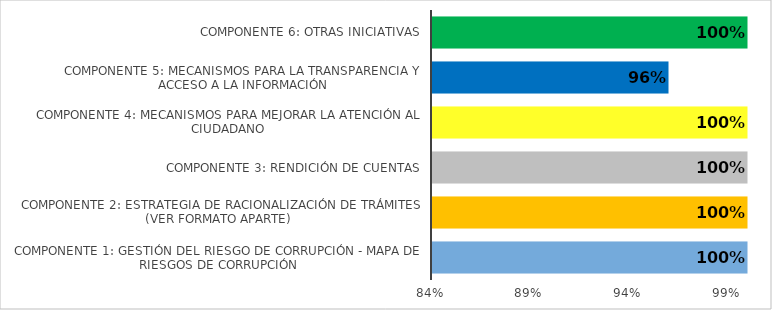
| Category | Series 0 |
|---|---|
| Componente 1: Gestión del Riesgo de Corrupción - Mapa de Riesgos de Corrupción | 1 |
| Componente 2: Estrategia de Racionalización de Trámites (ver formato aparte)  | 1 |
| Componente 3: Rendición de Cuentas | 1 |
| Componente 4: Mecanismos para Mejorar la Atención al Ciudadano | 1 |
| Componente 5: Mecanismos para la Transparencia y Acceso a la Información | 0.96 |
| Componente 6: Otras iniciativas | 1 |